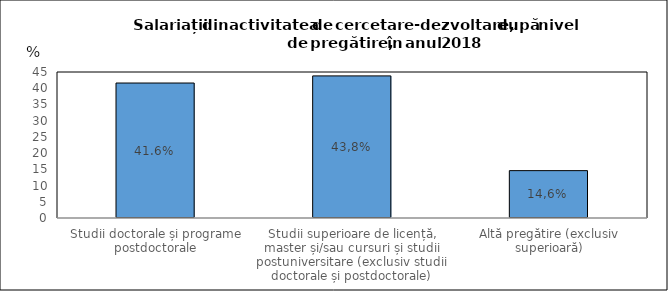
| Category | % |
|---|---|
| Studii doctorale și programe postdoctorale | 41.6 |
| Studii superioare de licență, master și/sau cursuri și studii postuniversitare (exclusiv studii doctorale și postdoctorale) | 43.8 |
| Altă pregătire (exclusiv superioară) | 14.6 |